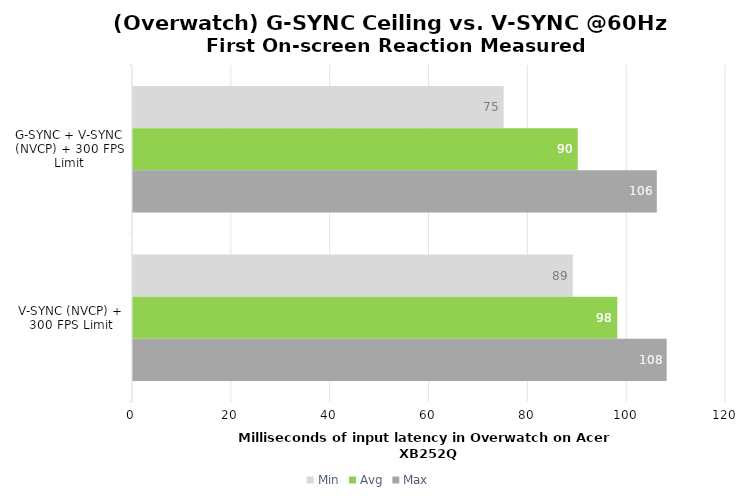
| Category | Min | Avg | Max |
|---|---|---|---|
| G-SYNC + V-SYNC (NVCP) + 300 FPS Limit | 75 | 90 | 106 |
| V-SYNC (NVCP) + 300 FPS Limit | 89 | 98 | 108 |